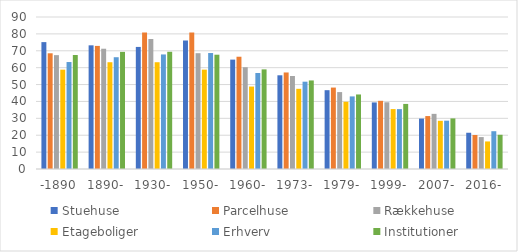
| Category | Stuehuse | Parcelhuse | Rækkehuse | Etageboliger | Erhverv | Institutioner |
|---|---|---|---|---|---|---|
| -1890 | 75.129 | 68.515 | 67.414 | 58.822 | 63.339 | 67.487 |
| 1890- | 73.227 | 72.885 | 71.217 | 63.221 | 66.184 | 69.356 |
| 1930- | 72.28 | 80.862 | 76.983 | 63.223 | 67.831 | 69.414 |
| 1950- | 76.018 | 80.757 | 68.575 | 58.832 | 68.668 | 67.674 |
| 1960- | 64.76 | 66.477 | 60.266 | 48.822 | 56.857 | 58.991 |
| 1973- | 55.485 | 57.154 | 55.066 | 47.481 | 51.698 | 52.433 |
| 1979- | 46.668 | 48.214 | 45.543 | 39.812 | 42.984 | 44.132 |
| 1999- | 39.416 | 40.369 | 39.519 | 35.474 | 35.457 | 38.53 |
| 2007- | 29.855 | 31.343 | 32.65 | 28.535 | 28.624 | 29.952 |
| 2016- | 21.464 | 20.128 | 18.9 | 16.318 | 22.376 | 20.263 |